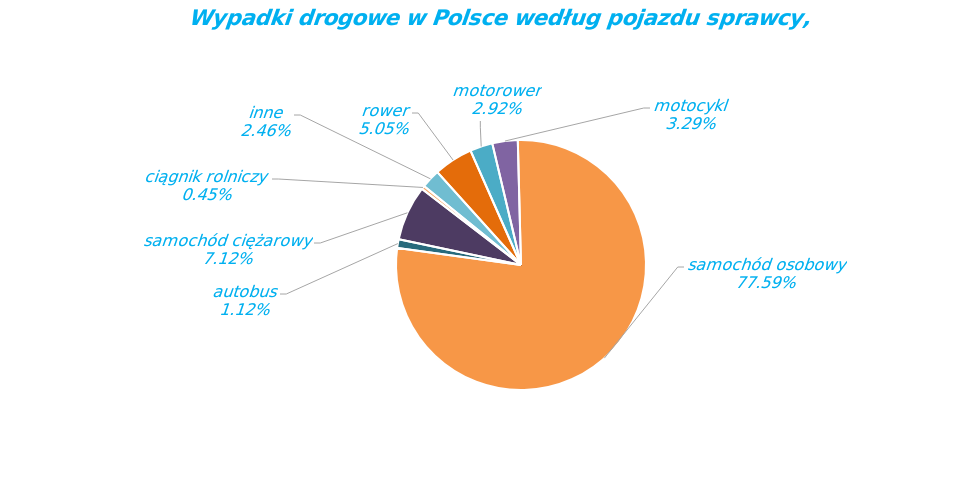
| Category | Series 0 |
|---|---|
| rower | 1770 |
| motorower | 1024 |
| motocykl | 1151 |
| samochód osobowy | 27190 |
| autobus | 394 |
| samochód ciężarowy | 2495 |
| ciągnik rolniczy | 159 |
| inne | 861 |